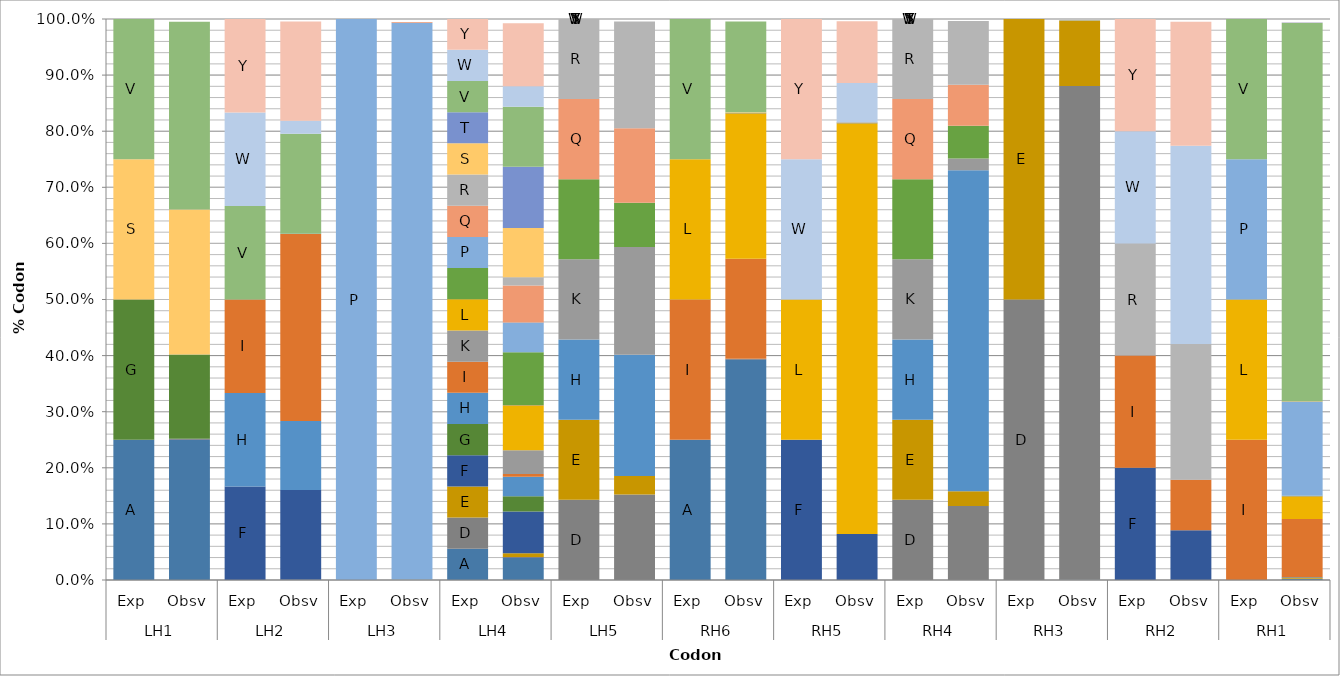
| Category | A | C | D | E | F | G | H | I | K | L | M | N | P | Q | R | S | T | V | W | Y |
|---|---|---|---|---|---|---|---|---|---|---|---|---|---|---|---|---|---|---|---|---|
| 0 | 0.25 | 0 | 0 | 0 | 0 | 0.25 | 0 | 0 | 0 | 0 | 0 | 0 | 0 | 0 | 0 | 0.25 | 0 | 0.25 | 0 | 0 |
| 1 | 0.251 | 0 | 0 | 0 | 0 | 0.15 | 0 | 0 | 0 | 0 | 0 | 0 | 0 | 0 | 0 | 0.258 | 0 | 0.334 | 0 | 0 |
| 2 | 0 | 0 | 0 | 0 | 0.167 | 0 | 0.167 | 0.167 | 0 | 0 | 0 | 0 | 0 | 0 | 0 | 0 | 0 | 0.167 | 0.167 | 0.167 |
| 3 | 0 | 0 | 0 | 0 | 0.16 | 0 | 0.123 | 0.333 | 0 | 0 | 0 | 0 | 0 | 0 | 0 | 0 | 0 | 0.178 | 0.023 | 0.177 |
| 4 | 0 | 0 | 0 | 0 | 0 | 0 | 0 | 0 | 0 | 0 | 0 | 0 | 1 | 0 | 0 | 0 | 0 | 0 | 0 | 0 |
| 5 | 0 | 0 | 0 | 0 | 0 | 0 | 0 | 0 | 0 | 0 | 0 | 0 | 0.993 | 0.001 | 0 | 0 | 0 | 0 | 0 | 0 |
| 6 | 0.056 | 0 | 0.056 | 0.056 | 0.056 | 0.056 | 0.056 | 0.056 | 0.056 | 0.056 | 0 | 0.056 | 0.056 | 0.056 | 0.056 | 0.056 | 0.056 | 0.056 | 0.056 | 0.056 |
| 7 | 0.04 | 0 | 0 | 0.007 | 0.075 | 0.027 | 0.035 | 0.005 | 0.042 | 0.08 | 0.001 | 0.094 | 0.053 | 0.066 | 0.015 | 0.088 | 0.109 | 0.107 | 0.037 | 0.112 |
| 8 | 0 | 0 | 0.143 | 0.143 | 0 | 0 | 0.143 | 0 | 0.143 | 0 | 0 | 0.143 | 0 | 0.143 | 0.143 | 0 | 0 | 0 | 0 | 0 |
| 9 | 0 | 0 | 0.152 | 0.033 | 0 | 0 | 0.216 | 0 | 0.192 | 0 | 0 | 0.079 | 0 | 0.133 | 0.19 | 0 | 0 | 0 | 0 | 0 |
| 10 | 0.25 | 0 | 0 | 0 | 0 | 0 | 0 | 0.25 | 0 | 0.25 | 0 | 0 | 0 | 0 | 0 | 0 | 0 | 0.25 | 0 | 0 |
| 11 | 0.394 | 0 | 0.001 | 0 | 0 | 0 | 0 | 0.178 | 0 | 0.26 | 0 | 0 | 0 | 0 | 0 | 0.001 | 0 | 0.162 | 0 | 0 |
| 12 | 0 | 0 | 0 | 0 | 0.25 | 0 | 0 | 0 | 0 | 0.25 | 0 | 0 | 0 | 0 | 0 | 0 | 0 | 0 | 0.25 | 0.25 |
| 13 | 0 | 0 | 0 | 0 | 0.082 | 0 | 0 | 0 | 0 | 0.732 | 0.001 | 0 | 0 | 0 | 0 | 0 | 0 | 0 | 0.07 | 0.11 |
| 14 | 0 | 0 | 0.143 | 0.143 | 0 | 0 | 0.143 | 0 | 0.143 | 0 | 0 | 0.143 | 0 | 0.143 | 0.143 | 0 | 0 | 0 | 0 | 0 |
| 15 | 0 | 0 | 0.132 | 0.026 | 0 | 0 | 0.572 | 0 | 0.021 | 0 | 0 | 0.058 | 0 | 0.073 | 0.114 | 0 | 0 | 0 | 0 | 0 |
| 16 | 0 | 0 | 0.5 | 0.5 | 0 | 0 | 0 | 0 | 0 | 0 | 0 | 0 | 0 | 0 | 0 | 0 | 0 | 0 | 0 | 0 |
| 17 | 0 | 0 | 0.88 | 0.117 | 0 | 0 | 0 | 0 | 0 | 0 | 0 | 0 | 0 | 0 | 0 | 0 | 0 | 0 | 0 | 0 |
| 18 | 0 | 0 | 0 | 0 | 0.2 | 0 | 0 | 0.2 | 0 | 0 | 0 | 0 | 0 | 0 | 0.2 | 0 | 0 | 0 | 0.2 | 0.2 |
| 19 | 0 | 0 | 0 | 0 | 0.088 | 0 | 0 | 0.09 | 0 | 0 | 0 | 0 | 0 | 0 | 0.242 | 0 | 0 | 0 | 0.354 | 0.221 |
| 20 | 0 | 0 | 0 | 0 | 0 | 0 | 0 | 0.25 | 0 | 0.25 | 0 | 0 | 0.25 | 0 | 0 | 0 | 0 | 0.25 | 0 | 0 |
| 21 | 0.002 | 0 | 0.001 | 0.001 | 0.001 | 0 | 0 | 0.104 | 0 | 0.041 | 0 | 0 | 0.167 | 0.001 | 0 | 0 | 0 | 0.675 | 0.002 | 0 |